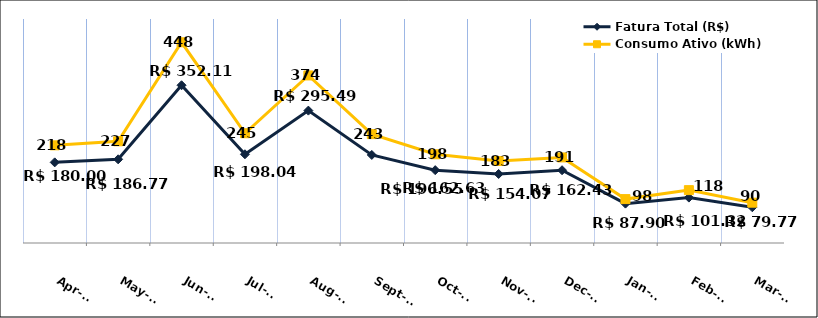
| Category | Fatura Total (R$) |
|---|---|
| 2023-04-01 | 180 |
| 2023-05-01 | 186.77 |
| 2023-06-01 | 352.11 |
| 2023-07-01 | 198.04 |
| 2023-08-01 | 295.49 |
| 2023-09-01 | 196.55 |
| 2023-10-01 | 162.63 |
| 2023-11-01 | 154.07 |
| 2023-12-01 | 162.43 |
| 2024-01-01 | 87.9 |
| 2024-02-01 | 101.32 |
| 2024-03-01 | 79.77 |